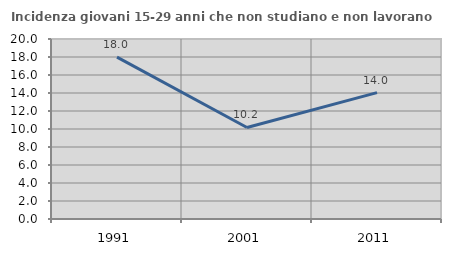
| Category | Incidenza giovani 15-29 anni che non studiano e non lavorano  |
|---|---|
| 1991.0 | 17.991 |
| 2001.0 | 10.169 |
| 2011.0 | 14.045 |